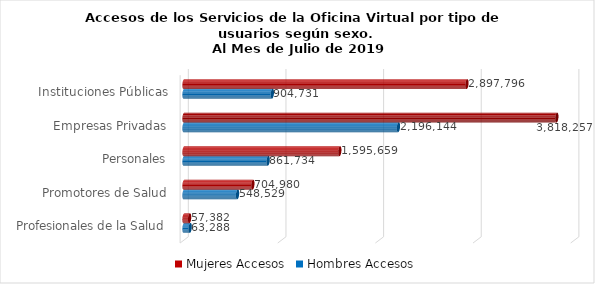
| Category | Mujeres | Hombres |
|---|---|---|
| Instituciones Públicas | 2897796 | 904731 |
| Empresas Privadas | 3818257 | 2196144 |
| Personales | 1595659 | 861734 |
| Promotores de Salud | 704980 | 548529 |
| Profesionales de la Salud | 57382 | 63288 |